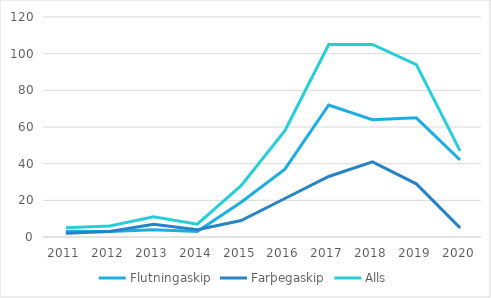
| Category | Flutningaskip | Farþegaskip | Alls |
|---|---|---|---|
| 2011.0 | 3 | 2 | 5 |
| 2012.0 | 3 | 3 | 6 |
| 2013.0 | 4 | 7 | 11 |
| 2014.0 | 3 | 4 | 7 |
| 2015.0 | 19 | 9 | 28 |
| 2016.0 | 37 | 21 | 58 |
| 2017.0 | 72 | 33 | 105 |
| 2018.0 | 64 | 41 | 105 |
| 2019.0 | 65 | 29 | 94 |
| 2020.0 | 42 | 5 | 47 |